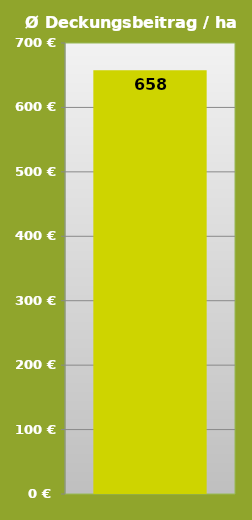
| Category | 658 |
|---|---|
| 0 | 657.876 |